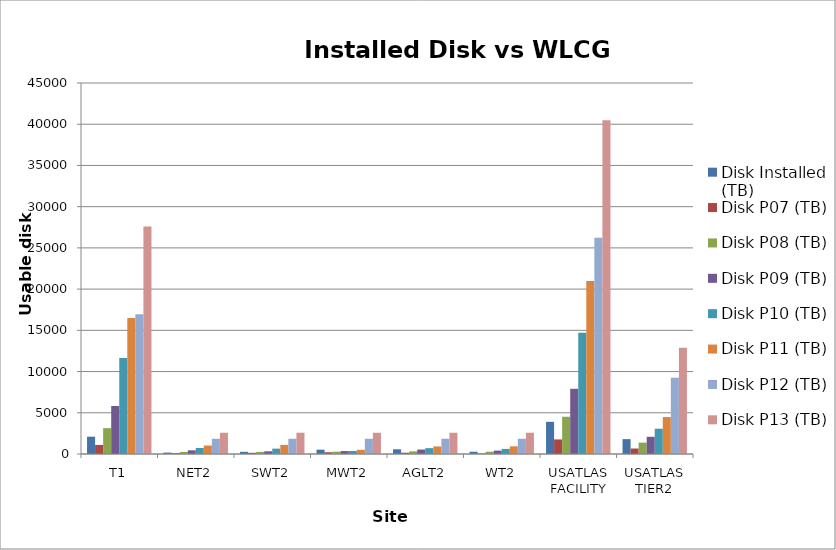
| Category | Disk Installed (TB) | Disk P07 (TB) | Disk P08 (TB) | Disk P09 (TB) | Disk P10 (TB) | Disk P11 (TB) | Disk P12 (TB) | Disk P13 (TB) |
|---|---|---|---|---|---|---|---|---|
| T1 | 2100 | 1100 | 3136 | 5822 | 11637 | 16509 | 16964.8 | 27600 |
| NET2 | 170 | 103 | 244 | 445 | 727 | 1024 | 1851 | 2577.6 |
| SWT2 | 263 | 143 | 256 | 328 | 650 | 1103 | 1851 | 2577.6 |
| MWT2 | 524 | 213 | 282 | 358 | 362 | 512 | 1851 | 2577.6 |
| AGLT2 | 570 | 155 | 322 | 542 | 709 | 914 | 1851 | 2577.6 |
| WT2 | 275 | 51 | 275 | 412.5 | 618.75 | 928.125 | 1851 | 2577.6 |
| USATLAS FACILITY | 3902 | 1765 | 4515 | 7907.5 | 14703.75 | 20990.125 | 26219.8 | 40488 |
| USATLAS TIER2 | 1802 | 665 | 1379 | 2085.5 | 3066.75 | 4481.125 | 9255 | 12888 |